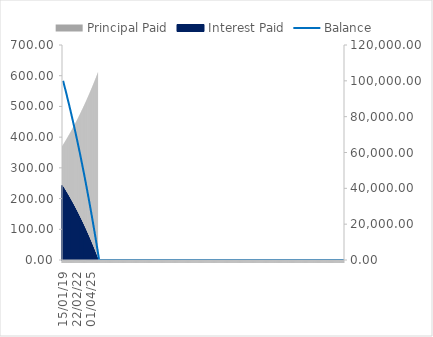
| Category | Principal Paid | Interest Paid |
|---|---|---|
| 15/01/19 | 370.238 | 242.504 |
| 29/01/19 | 371.136 | 241.606 |
| 12/02/19 | 372.036 | 240.706 |
| 26/02/19 | 372.938 | 239.804 |
| 12/03/19 | 373.843 | 238.9 |
| 26/03/19 | 374.749 | 237.993 |
| 09/04/19 | 375.658 | 237.085 |
| 23/04/19 | 376.569 | 236.174 |
| 07/05/19 | 377.482 | 235.26 |
| 21/05/19 | 378.397 | 234.345 |
| 04/06/19 | 379.315 | 233.427 |
| 18/06/19 | 380.235 | 232.507 |
| 02/07/19 | 381.157 | 231.585 |
| 16/07/19 | 382.081 | 230.661 |
| 30/07/19 | 383.008 | 229.734 |
| 13/08/19 | 383.937 | 228.806 |
| 27/08/19 | 384.868 | 227.875 |
| 10/09/19 | 385.801 | 226.941 |
| 24/09/19 | 386.737 | 226.006 |
| 08/10/19 | 387.675 | 225.068 |
| 22/10/19 | 388.615 | 224.128 |
| 05/11/19 | 389.557 | 223.185 |
| 19/11/19 | 390.502 | 222.241 |
| 03/12/19 | 391.449 | 221.294 |
| 17/12/19 | 392.398 | 220.344 |
| 31/12/19 | 393.35 | 219.393 |
| 14/01/20 | 394.304 | 218.439 |
| 28/01/20 | 395.26 | 217.483 |
| 11/02/20 | 396.218 | 216.524 |
| 25/02/20 | 397.179 | 215.563 |
| 10/03/20 | 398.142 | 214.6 |
| 24/03/20 | 399.108 | 213.635 |
| 07/04/20 | 400.076 | 212.667 |
| 21/04/20 | 401.046 | 211.697 |
| 05/05/20 | 402.018 | 210.724 |
| 19/05/20 | 402.993 | 209.749 |
| 02/06/20 | 403.971 | 208.772 |
| 16/06/20 | 404.95 | 207.792 |
| 30/06/20 | 405.932 | 206.81 |
| 14/07/20 | 406.917 | 205.826 |
| 28/07/20 | 407.903 | 204.839 |
| 11/08/20 | 408.893 | 203.85 |
| 25/08/20 | 409.884 | 202.858 |
| 08/09/20 | 410.878 | 201.864 |
| 22/09/20 | 411.875 | 200.868 |
| 06/10/20 | 412.873 | 199.869 |
| 20/10/20 | 413.875 | 198.868 |
| 03/11/20 | 414.878 | 197.864 |
| 17/11/20 | 415.884 | 196.858 |
| 01/12/20 | 416.893 | 195.849 |
| 15/12/20 | 417.904 | 194.838 |
| 29/12/20 | 418.917 | 193.825 |
| 12/01/21 | 419.933 | 192.809 |
| 26/01/21 | 420.952 | 191.791 |
| 09/02/21 | 421.972 | 190.77 |
| 23/02/21 | 422.996 | 189.747 |
| 09/03/21 | 424.022 | 188.721 |
| 23/03/21 | 425.05 | 187.693 |
| 06/04/21 | 426.081 | 186.662 |
| 20/04/21 | 427.114 | 185.629 |
| 04/05/21 | 428.15 | 184.593 |
| 18/05/21 | 429.188 | 183.555 |
| 01/06/21 | 430.229 | 182.514 |
| 15/06/21 | 431.272 | 181.47 |
| 29/06/21 | 432.318 | 180.425 |
| 13/07/21 | 433.366 | 179.376 |
| 27/07/21 | 434.417 | 178.325 |
| 10/08/21 | 435.471 | 177.272 |
| 24/08/21 | 436.527 | 176.216 |
| 07/09/21 | 437.585 | 175.157 |
| 21/09/21 | 438.646 | 174.096 |
| 05/10/21 | 439.71 | 173.032 |
| 19/10/21 | 440.777 | 171.966 |
| 02/11/21 | 441.845 | 170.897 |
| 16/11/21 | 442.917 | 169.825 |
| 30/11/21 | 443.991 | 168.751 |
| 14/12/21 | 445.068 | 167.675 |
| 28/12/21 | 446.147 | 166.595 |
| 11/01/22 | 447.229 | 165.513 |
| 25/01/22 | 448.313 | 164.429 |
| 08/02/22 | 449.401 | 163.342 |
| 22/02/22 | 450.49 | 162.252 |
| 08/03/22 | 451.583 | 161.159 |
| 22/03/22 | 452.678 | 160.064 |
| 05/04/22 | 453.776 | 158.967 |
| 19/04/22 | 454.876 | 157.866 |
| 03/05/22 | 455.979 | 156.763 |
| 17/05/22 | 457.085 | 155.657 |
| 31/05/22 | 458.194 | 154.549 |
| 14/06/22 | 459.305 | 153.438 |
| 28/06/22 | 460.419 | 152.324 |
| 12/07/22 | 461.535 | 151.207 |
| 26/07/22 | 462.654 | 150.088 |
| 09/08/22 | 463.776 | 148.966 |
| 23/08/22 | 464.901 | 147.841 |
| 06/09/22 | 466.028 | 146.714 |
| 20/09/22 | 467.158 | 145.584 |
| 04/10/22 | 468.291 | 144.451 |
| 18/10/22 | 469.427 | 143.315 |
| 01/11/22 | 470.565 | 142.177 |
| 15/11/22 | 471.707 | 141.036 |
| 29/11/22 | 472.85 | 139.892 |
| 13/12/22 | 473.997 | 138.745 |
| 27/12/22 | 475.147 | 137.596 |
| 10/01/23 | 476.299 | 136.444 |
| 24/01/23 | 477.454 | 135.289 |
| 07/02/23 | 478.612 | 134.131 |
| 21/02/23 | 479.772 | 132.97 |
| 07/03/23 | 480.936 | 131.807 |
| 21/03/23 | 482.102 | 130.64 |
| 04/04/23 | 483.271 | 129.471 |
| 18/04/23 | 484.443 | 128.299 |
| 02/05/23 | 485.618 | 127.124 |
| 16/05/23 | 486.796 | 125.947 |
| 30/05/23 | 487.976 | 124.766 |
| 13/06/23 | 489.16 | 123.583 |
| 27/06/23 | 490.346 | 122.397 |
| 11/07/23 | 491.535 | 121.208 |
| 25/07/23 | 492.727 | 120.016 |
| 08/08/23 | 493.922 | 118.821 |
| 22/08/23 | 495.12 | 117.623 |
| 05/09/23 | 496.32 | 116.422 |
| 19/09/23 | 497.524 | 115.219 |
| 03/10/23 | 498.73 | 114.012 |
| 17/10/23 | 499.94 | 112.803 |
| 31/10/23 | 501.152 | 111.59 |
| 14/11/23 | 502.367 | 110.375 |
| 28/11/23 | 503.586 | 109.157 |
| 12/12/23 | 504.807 | 107.935 |
| 26/12/23 | 506.031 | 106.711 |
| 09/01/24 | 507.258 | 105.484 |
| 23/01/24 | 508.488 | 104.254 |
| 06/02/24 | 509.721 | 103.021 |
| 20/02/24 | 510.958 | 101.785 |
| 05/03/24 | 512.197 | 100.546 |
| 19/03/24 | 513.439 | 99.304 |
| 02/04/24 | 514.684 | 98.059 |
| 16/04/24 | 515.932 | 96.81 |
| 30/04/24 | 517.183 | 95.559 |
| 14/05/24 | 518.437 | 94.305 |
| 28/05/24 | 519.695 | 93.048 |
| 11/06/24 | 520.955 | 91.788 |
| 25/06/24 | 522.218 | 90.524 |
| 09/07/24 | 523.485 | 89.258 |
| 23/07/24 | 524.754 | 87.988 |
| 06/08/24 | 526.027 | 86.716 |
| 20/08/24 | 527.302 | 85.44 |
| 03/09/24 | 528.581 | 84.161 |
| 17/09/24 | 529.863 | 82.88 |
| 01/10/24 | 531.148 | 81.595 |
| 15/10/24 | 532.436 | 80.307 |
| 29/10/24 | 533.727 | 79.015 |
| 12/11/24 | 535.021 | 77.721 |
| 26/11/24 | 536.319 | 76.424 |
| 10/12/24 | 537.619 | 75.123 |
| 24/12/24 | 538.923 | 73.819 |
| 07/01/25 | 540.23 | 72.512 |
| 21/01/25 | 541.54 | 71.202 |
| 04/02/25 | 542.853 | 69.889 |
| 18/02/25 | 544.17 | 68.573 |
| 04/03/25 | 545.489 | 67.253 |
| 18/03/25 | 546.812 | 65.93 |
| 01/04/25 | 548.138 | 64.604 |
| 15/04/25 | 549.468 | 63.275 |
| 29/04/25 | 550.8 | 61.942 |
| 13/05/25 | 552.136 | 60.607 |
| 27/05/25 | 553.475 | 59.268 |
| 10/06/25 | 554.817 | 57.925 |
| 24/06/25 | 556.162 | 56.58 |
| 08/07/25 | 557.511 | 55.231 |
| 22/07/25 | 558.863 | 53.879 |
| 05/08/25 | 560.218 | 52.524 |
| 19/08/25 | 561.577 | 51.165 |
| 02/09/25 | 562.939 | 49.804 |
| 16/09/25 | 564.304 | 48.438 |
| 30/09/25 | 565.672 | 47.07 |
| 14/10/25 | 567.044 | 45.698 |
| 28/10/25 | 568.419 | 44.323 |
| 11/11/25 | 569.798 | 42.945 |
| 25/11/25 | 571.179 | 41.563 |
| 09/12/25 | 572.565 | 40.178 |
| 23/12/25 | 573.953 | 38.789 |
| 06/01/26 | 575.345 | 37.397 |
| 20/01/26 | 576.74 | 36.002 |
| 03/02/26 | 578.139 | 34.604 |
| 17/02/26 | 579.541 | 33.202 |
| 03/03/26 | 580.946 | 31.796 |
| 17/03/26 | 582.355 | 30.387 |
| 31/03/26 | 583.767 | 28.975 |
| 14/04/26 | 585.183 | 27.559 |
| 28/04/26 | 586.602 | 26.14 |
| 12/05/26 | 588.025 | 24.718 |
| 26/05/26 | 589.451 | 23.292 |
| 09/06/26 | 590.88 | 21.862 |
| 23/06/26 | 592.313 | 20.429 |
| 07/07/26 | 593.749 | 18.993 |
| 21/07/26 | 595.189 | 17.553 |
| 04/08/26 | 596.633 | 16.11 |
| 18/08/26 | 598.079 | 14.663 |
| 01/09/26 | 599.53 | 13.213 |
| 15/09/26 | 600.984 | 11.759 |
| 29/09/26 | 602.441 | 10.301 |
| 13/10/26 | 603.902 | 8.84 |
| 27/10/26 | 605.367 | 7.376 |
| 10/11/26 | 606.835 | 5.908 |
| 24/11/26 | 608.306 | 4.436 |
| 08/12/26 | 609.781 | 2.961 |
| 22/12/26 | 611.26 | 1.482 |